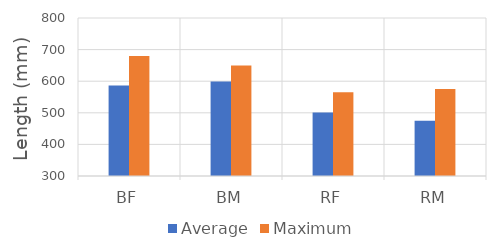
| Category | Average | Maximum |
|---|---|---|
| BF | 586 | 680 |
| BM | 599 | 650 |
| RF | 501 | 565 |
| RM | 475 | 575 |